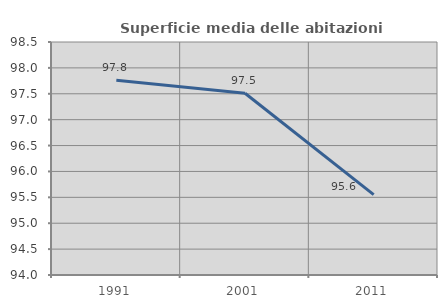
| Category | Superficie media delle abitazioni occupate |
|---|---|
| 1991.0 | 97.761 |
| 2001.0 | 97.511 |
| 2011.0 | 95.551 |